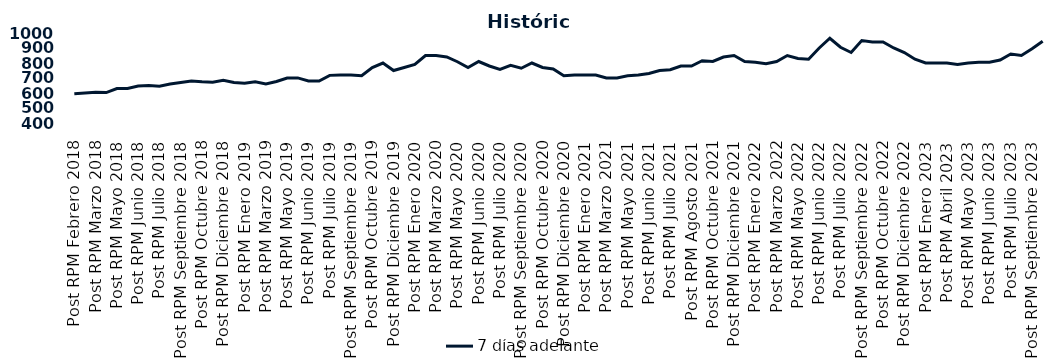
| Category | 7 días adelante  |
|---|---|
| Post RPM Febrero 2018 | 595 |
| Pre RPM Marzo 2018 | 600 |
| Post RPM Marzo 2018 | 605 |
| Pre RPM Mayo 2018 | 603 |
| Post RPM Mayo 2018 | 630 |
| Pre RPM Junio 2018 | 630 |
| Post RPM Junio 2018 | 646.5 |
| Pre RPM Julio 2018 | 650 |
| Post RPM Julio 2018 | 645 |
| Pre RPM Septiembre 2018 | 660 |
| Post RPM Septiembre 2018 | 670 |
| Pre RPM Octubre 2018 | 680 |
| Post RPM Octubre 2018 | 675 |
| Pre RPM Diciembre 2018 | 672.5 |
| Post RPM Diciembre 2018 | 685 |
| Pre RPM Enero 2019 | 670 |
| Post RPM Enero 2019 | 665 |
| Pre RPM Marzo 2019 | 675 |
| Post RPM Marzo 2019 | 661 |
| Pre RPM Mayo 2019 | 677 |
| Post RPM Mayo 2019 | 700 |
| Pre RPM Junio 2019 | 700.5 |
| Post RPM Junio 2019 | 680 |
| Pre RPM Julio 2019 | 680 |
| Post RPM Julio 2019 | 717.5 |
| Pre RPM Septiembre 2019 | 720 |
| Post RPM Septiembre 2019 | 720 |
| Pre RPM Octubre 2019 | 715 |
| Post RPM Octubre 2019 | 770 |
| Pre RPM Diciembre 2019 | 800 |
| Post RPM Diciembre 2019 | 750 |
| Pre RPM Enero 2020 | 770 |
| Post RPM Enero 2020 | 790 |
| Pre RPM Marzo 2020 | 850 |
| Post RPM Marzo 2020 | 850 |
| Pre RPM Mayo 2020 | 840 |
| Post RPM Mayo 2020 | 808.5 |
| Pre RPM Junio 2020 | 770 |
| Post RPM Junio 2020 | 810 |
| Pre RPM Julio 2020 | 780 |
| Post RPM Julio 2020 | 757 |
| Pre RPM Septiembre 2020 | 785 |
| Post RPM Septiembre 2020 | 765 |
| Pre RPM Octubre 2020 | 800 |
| Post RPM Octubre 2020 | 770 |
| Pre RPM Diciembre 2020 | 760 |
| Post RPM Diciembre 2020 | 715 |
| Pre RPM Enero 2021 | 720 |
| Post RPM Enero 2021 | 720 |
| Pre RPM Marzo 2021 | 720 |
| Post RPM Marzo 2021 | 700 |
| Pre RPM Mayo 2021 | 700 |
| Post RPM Mayo 2021 | 715 |
| Pre RPM Junio 2021 | 720 |
| Post RPM Junio 2021 | 730 |
| Pre RPM Julio 2021 | 750 |
| Post RPM Julio 2021 | 755 |
| Pre RPM Agosto 2021 | 780 |
| Post RPM Agosto 2021 | 780 |
| Pre RPM Octubre 2021 | 815 |
| Post RPM Octubre 2021 | 810 |
| Pre RPM Diciembre 2021 | 840 |
| Post RPM Diciembre 2021 | 850 |
| Pre RPM Enero 2022 | 810 |
| Post RPM Enero 2022 | 805 |
| Pre RPM Marzo 2022 | 795 |
| Post RPM Marzo 2022 | 810 |
| Pre RPM Mayo 2022 | 850 |
| Post RPM Mayo 2022 | 830 |
| Pre RPM Junio 2022 | 825 |
| Post RPM Junio 2022 | 900 |
| Pre RPM Julio 2022 | 965 |
| Post RPM Julio 2022 | 905 |
| Pre RPM Septiembre 2022 | 870 |
| Post RPM Septiembre 2022 | 950 |
| Pre RPM Octubre 2022 | 940 |
| Post RPM Octubre 2022 | 940 |
| Pre RPM Diciembre 2022 | 900 |
| Post RPM Diciembre 2022 | 870 |
| Pre RPM Enero 2023 | 825 |
| Post RPM Enero 2023 | 800 |
| Pre RPM Abril 2023 | 800 |
| Post RPM Abril 2023 | 800 |
| Pre RPM Mayo 2023 | 790 |
| Post RPM Mayo 2023 | 800 |
| Pre RPM Junio 2023 | 805 |
| Post RPM Junio 2023 | 805 |
| Pre RPM Julio 2023 | 820 |
| Post RPM Julio 2023 | 860 |
| Pre RPM Septiembre 2023 | 850 |
| Post RPM Septiembre 2023 | 895 |
| Pre RPM Octubre 2023 | 945 |